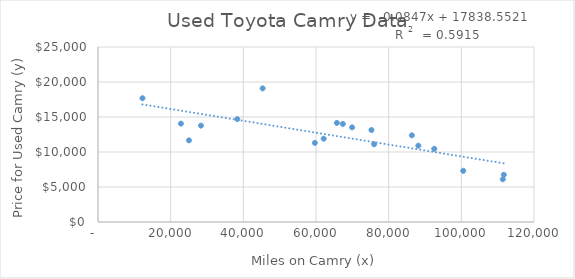
| Category | Price for Used Camry (y) |
|---|---|
| 22820.0 | 14053 |
| 28339.0 | 13766 |
| 38341.0 | 14697 |
| 45308.0 | 19090 |
| 65752.0 | 14157 |
| 75982.0 | 11111 |
| 75268.0 | 13138 |
| 86385.0 | 12381 |
| 92549.0 | 10458 |
| 100524.0 | 7313 |
| 111416.0 | 6106 |
| 25038.0 | 11667 |
| 59686.0 | 11298 |
| 67392.0 | 14010 |
| 69929.0 | 13523 |
| 88167.0 | 10905 |
| 12238.0 | 17683 |
| 62116.0 | 11900 |
| 111693.0 | 6748 |